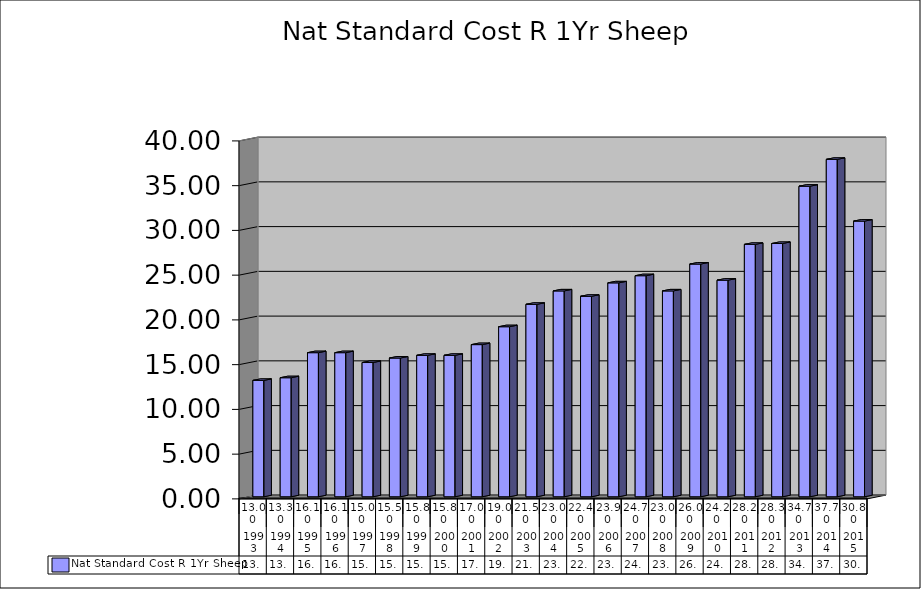
| Category | Nat Standard Cost R 1Yr Sheep |
|---|---|
| 0 | 13 |
| 1 | 13.3 |
| 2 | 16.1 |
| 3 | 16.1 |
| 4 | 15 |
| 5 | 15.5 |
| 6 | 15.8 |
| 7 | 15.8 |
| 8 | 17 |
| 9 | 19 |
| 10 | 21.5 |
| 11 | 23 |
| 12 | 22.4 |
| 13 | 23.9 |
| 14 | 24.7 |
| 15 | 23 |
| 16 | 26 |
| 17 | 24.2 |
| 18 | 28.2 |
| 19 | 28.3 |
| 20 | 34.7 |
| 21 | 37.7 |
| 22 | 30.8 |